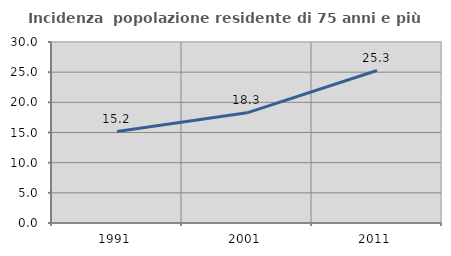
| Category | Incidenza  popolazione residente di 75 anni e più |
|---|---|
| 1991.0 | 15.152 |
| 2001.0 | 18.261 |
| 2011.0 | 25.275 |